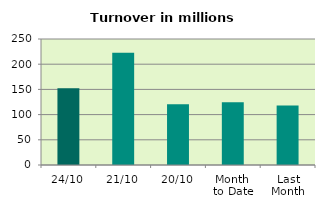
| Category | Series 0 |
|---|---|
| 24/10 | 152.294 |
| 21/10 | 222.883 |
| 20/10 | 120.571 |
| Month 
to Date | 124.509 |
| Last
Month | 117.918 |